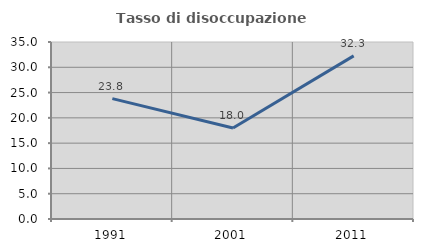
| Category | Tasso di disoccupazione giovanile  |
|---|---|
| 1991.0 | 23.81 |
| 2001.0 | 18 |
| 2011.0 | 32.258 |